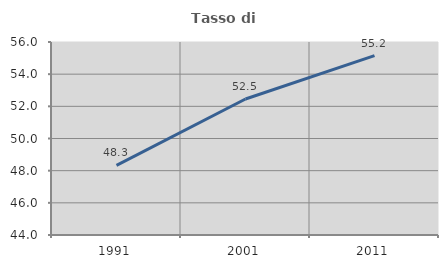
| Category | Tasso di occupazione   |
|---|---|
| 1991.0 | 48.33 |
| 2001.0 | 52.456 |
| 2011.0 | 55.154 |